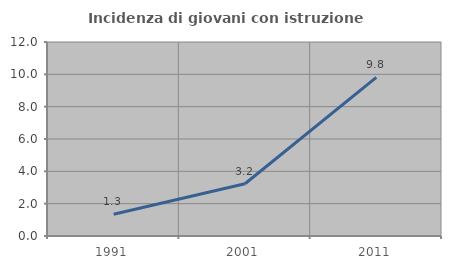
| Category | Incidenza di giovani con istruzione universitaria |
|---|---|
| 1991.0 | 1.348 |
| 2001.0 | 3.234 |
| 2011.0 | 9.816 |